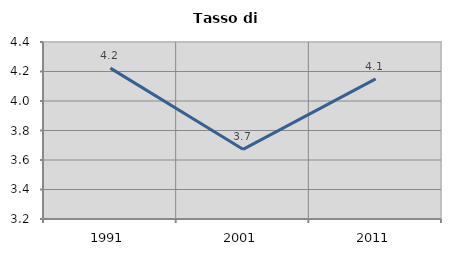
| Category | Tasso di disoccupazione   |
|---|---|
| 1991.0 | 4.223 |
| 2001.0 | 3.672 |
| 2011.0 | 4.15 |